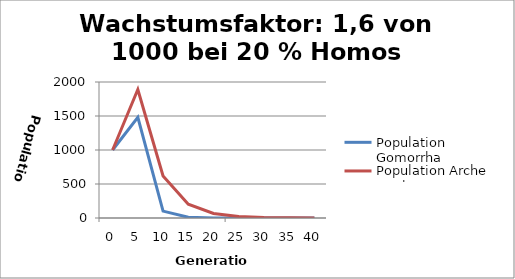
| Category | Population Gomorrha | Population Arche Noah |
|---|---|---|
| 0.0 | 1000 | 1000 |
| 5.0 | 1479.516 | 1889.28 |
| 10.0 | 101.672 | 619.079 |
| 15.0 | 10.917 | 202.86 |
| 20.0 | 1.172 | 66.473 |
| 25.0 | 0.126 | 21.782 |
| 30.0 | 0.014 | 7.137 |
| 35.0 | 0.001 | 2.339 |
| 40.0 | 0 | 0.766 |